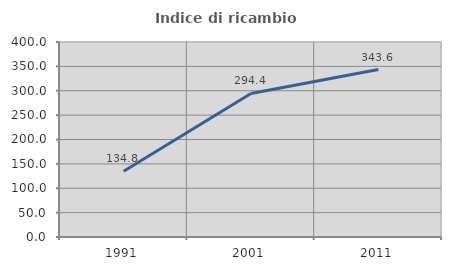
| Category | Indice di ricambio occupazionale  |
|---|---|
| 1991.0 | 134.783 |
| 2001.0 | 294.444 |
| 2011.0 | 343.59 |